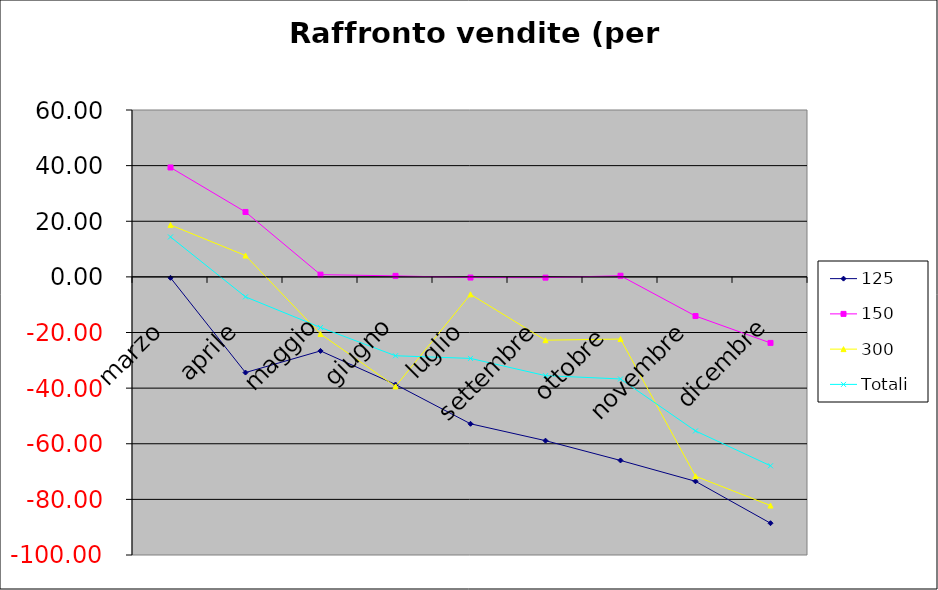
| Category | 125 | 150 | 300 | Totali |
|---|---|---|---|---|
| marzo | -0.334 | 39.333 | 18.667 | 14.357 |
| aprile | -34.4 | 23.333 | 7.667 | -7.182 |
| maggio | -26.622 | 0.8 | -20.533 | -18.188 |
| giugno | -38.7 | 0.364 | -39.394 | -28.362 |
| luglio | -52.824 | -0.244 | -6.286 | -29.317 |
| settembre | -58.889 | -0.278 | -22.769 | -35.516 |
| ottobre  | -66 | 0.4 | -22.353 | -36.707 |
| novembre | -73.5 | -14.074 | -71.667 | -55.385 |
| dicembre | -88.571 | -23.75 | -82.222 | -67.925 |